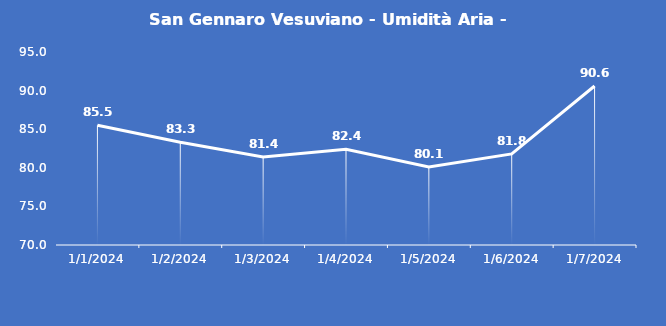
| Category | San Gennaro Vesuviano - Umidità Aria - Grezzo (%) |
|---|---|
| 1/1/24 | 85.5 |
| 1/2/24 | 83.3 |
| 1/3/24 | 81.4 |
| 1/4/24 | 82.4 |
| 1/5/24 | 80.1 |
| 1/6/24 | 81.8 |
| 1/7/24 | 90.6 |